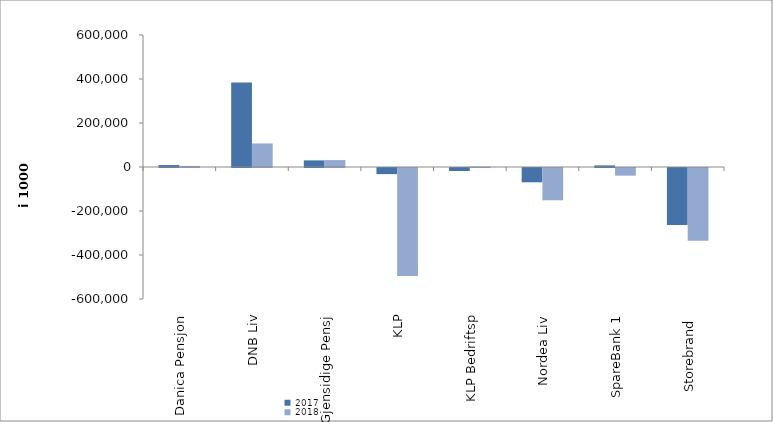
| Category | 2017 | 2018 |
|---|---|---|
| Danica Pensjon | 8925.642 | 4929.812 |
| DNB Liv | 384120 | 107071 |
| Gjensidige Pensj | 30047.581 | 31387 |
| KLP | -27827.164 | -491426.718 |
| KLP Bedriftsp | -13752 | 2189 |
| Nordea Liv | -64871.014 | -146808.559 |
| SpareBank 1 | 7266.884 | -34677.967 |
| Storebrand  | -259239.611 | -330309.93 |